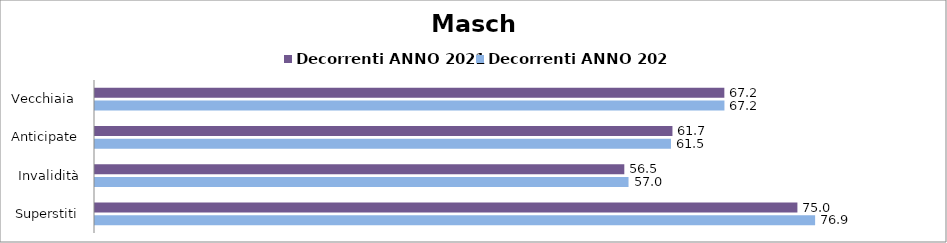
| Category | Decorrenti ANNO 2021 | Decorrenti ANNO 2022 |
|---|---|---|
| Vecchiaia  | 67.19 | 67.2 |
| Anticipate | 61.65 | 61.49 |
| Invalidità | 56.51 | 56.96 |
| Superstiti | 74.99 | 76.88 |